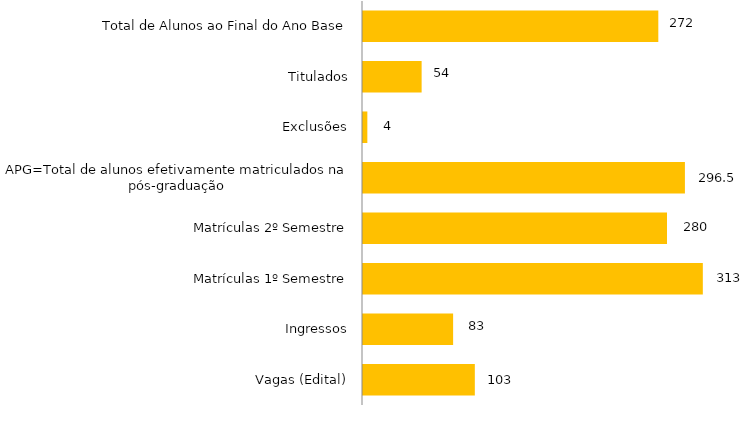
| Category | Curso |
|---|---|
| Vagas (Edital) | 103 |
| Ingressos | 83 |
| Matrículas 1º Semestre | 313 |
| Matrículas 2º Semestre | 280 |
| APG=Total de alunos efetivamente matriculados na pós-graduação | 296.5 |
| Exclusões | 4 |
| Titulados | 54 |
| Total de Alunos ao Final do Ano Base | 272 |